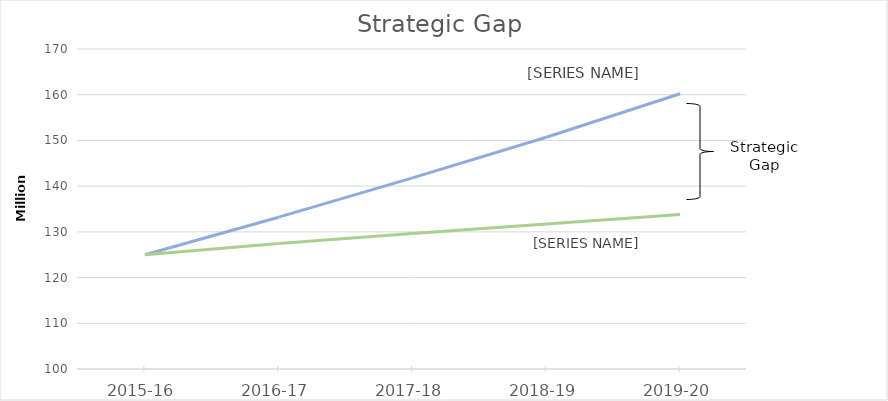
| Category | Strategically Balanced | Financially Balanced |
|---|---|---|
| 2015-16 | 124981637 | 124981637 |
| 2016-17 | 133209443.44 | 127471471.7 |
| 2017-18 | 141816889.829 | 129650174.318 |
| 2018-19 | 150697468.13 | 131702240.704 |
| 2019-20 | 160212102.774 | 133793348.418 |